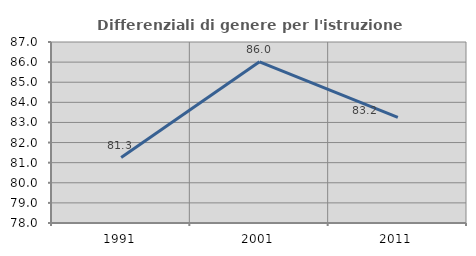
| Category | Differenziali di genere per l'istruzione superiore |
|---|---|
| 1991.0 | 81.253 |
| 2001.0 | 86.015 |
| 2011.0 | 83.248 |